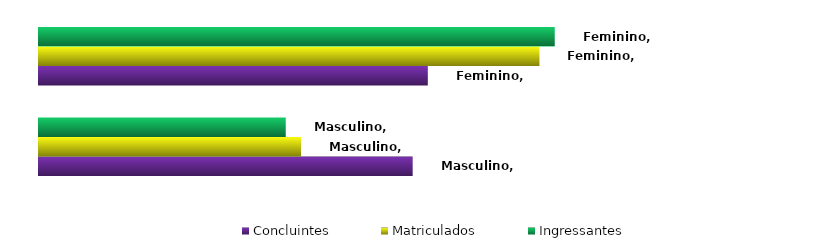
| Category | Concluintes | Matriculados | Ingressantes |
|---|---|---|---|
| Masculino | 0.49 | 0.344 | 0.324 |
| Feminino | 0.51 | 0.656 | 0.676 |